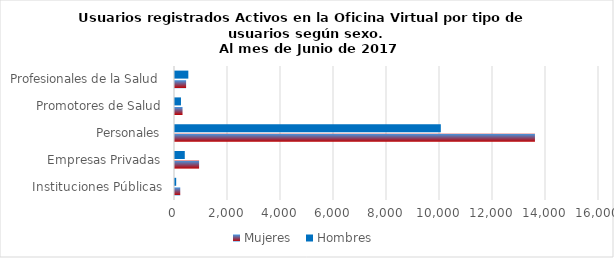
| Category | Mujeres | Hombres |
|---|---|---|
| Instituciones Públicas | 198 | 45 |
| Empresas Privadas | 909 | 369 |
| Personales | 13583 | 10031 |
| Promotores de Salud | 284 | 225 |
| Profesionales de la Salud | 419 | 503 |